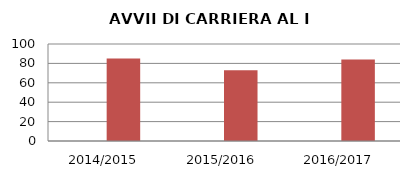
| Category | ANNO | NUMERO |
|---|---|---|
| 2014/2015 | 0 | 85 |
| 2015/2016 | 0 | 73 |
| 2016/2017 | 0 | 84 |